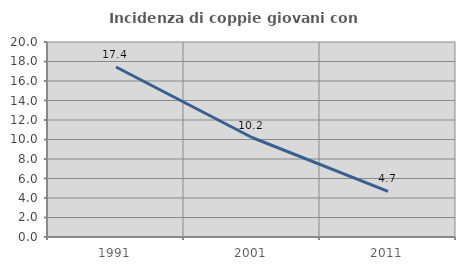
| Category | Incidenza di coppie giovani con figli |
|---|---|
| 1991.0 | 17.435 |
| 2001.0 | 10.204 |
| 2011.0 | 4.675 |